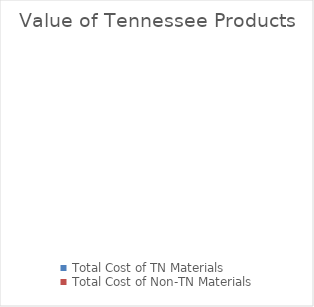
| Category | Series 0 |
|---|---|
| Total Cost of TN Materials | 0 |
| Total Cost of Non-TN Materials  | 0 |